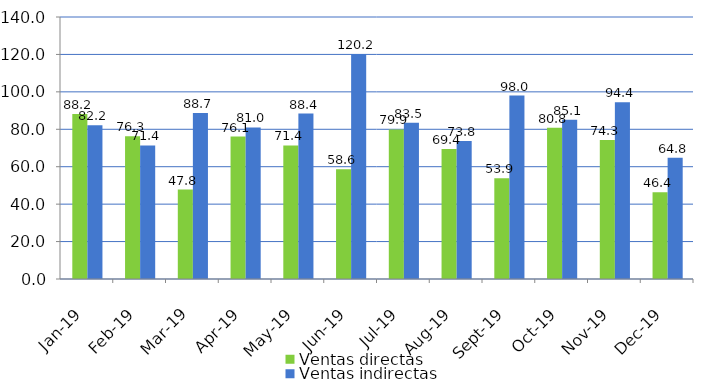
| Category | Ventas directas | Ventas indirectas |
|---|---|---|
| 2019-01-01 | 88.2 | 82.2 |
| 2019-02-01 | 76.3 | 71.4 |
| 2019-03-01 | 47.8 | 88.7 |
| 2019-04-01 | 76.1 | 81 |
| 2019-05-01 | 71.4 | 88.4 |
| 2019-06-01 | 58.6 | 120.2 |
| 2019-07-01 | 79.9 | 83.5 |
| 2019-08-01 | 69.4 | 73.8 |
| 2019-09-01 | 53.9 | 98 |
| 2019-10-01 | 80.8 | 85.1 |
| 2019-11-01 | 74.3 | 94.4 |
| 2019-12-01 | 46.4 | 64.8 |